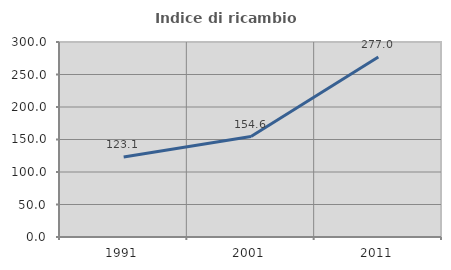
| Category | Indice di ricambio occupazionale  |
|---|---|
| 1991.0 | 123.081 |
| 2001.0 | 154.581 |
| 2011.0 | 276.977 |